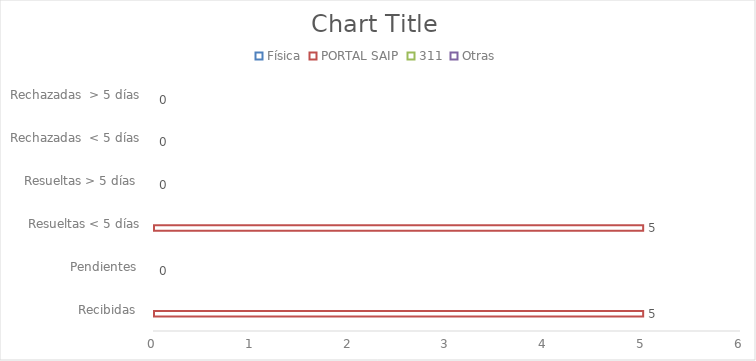
| Category | Física | PORTAL SAIP | 311 | Otras |
|---|---|---|---|---|
| Recibidas  | 0 | 5 | 0 | 0 |
| Pendientes  | 0 | 0 | 0 | 0 |
| Resueltas < 5 días | 0 | 5 | 0 | 0 |
| Resueltas > 5 días  | 0 | 0 | 0 | 0 |
| Rechazadas  < 5 días | 0 | 0 | 0 | 0 |
| Rechazadas  > 5 días | 0 | 0 | 0 | 0 |